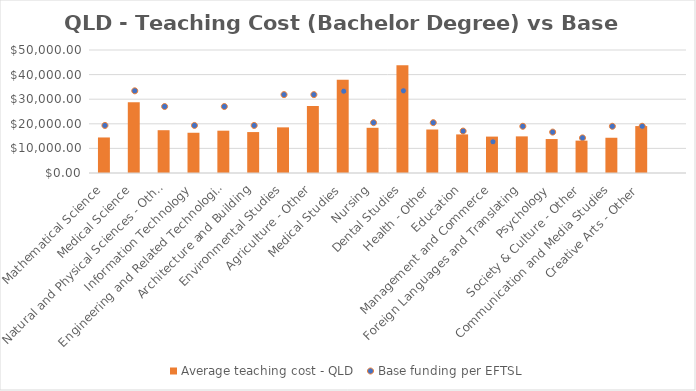
| Category | Average teaching cost - QLD  |
|---|---|
| Mathematical Science | 14444.535 |
| Medical Science | 28809.643 |
| Natural and Physical Sciences - Other | 17394.162 |
| Information Technology | 16358.028 |
| Engineering and Related Technologies | 17201.123 |
| Architecture and Building | 16640.826 |
| Environmental Studies | 18553.999 |
| Agriculture - Other | 27286.345 |
| Medical Studies | 37879.76 |
| Nursing | 18374.691 |
| Dental Studies | 43758.099 |
| Health - Other | 17680.574 |
| Education | 15686.399 |
| Management and Commerce | 14797.41 |
| Foreign Languages and Translating | 14888.538 |
| Psychology | 13809.273 |
| Society & Culture - Other | 13160.63 |
| Communication and Media Studies | 14328.233 |
| Creative Arts - Other | 19077.058 |